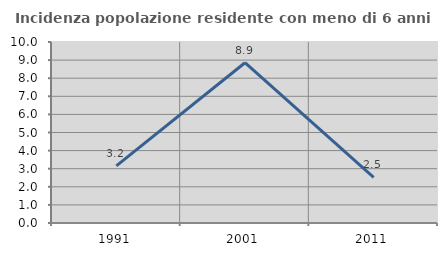
| Category | Incidenza popolazione residente con meno di 6 anni |
|---|---|
| 1991.0 | 3.158 |
| 2001.0 | 8.854 |
| 2011.0 | 2.525 |